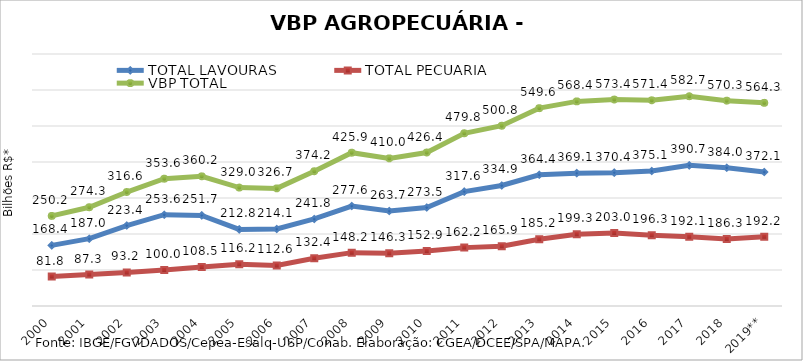
| Category | TOTAL LAVOURAS | TOTAL PECUÁRIA | VBP TOTAL |
|---|---|---|---|
| 2000 | 168.359 | 81.837 | 250.196 |
| 2001 | 187.015 | 87.31 | 274.325 |
| 2002 | 223.396 | 93.204 | 316.6 |
| 2003 | 253.553 | 100.038 | 353.591 |
| 2004 | 251.697 | 108.513 | 360.21 |
| 2005 | 212.798 | 116.244 | 329.042 |
| 2006 | 214.098 | 112.583 | 326.682 |
| 2007 | 241.785 | 132.448 | 374.233 |
| 2008 | 277.629 | 148.241 | 425.87 |
| 2009 | 263.71 | 146.313 | 410.024 |
| 2010 | 273.497 | 152.869 | 426.366 |
| 2011 | 317.633 | 162.155 | 479.788 |
| 2012 | 334.905 | 165.875 | 500.78 |
| 2013 | 364.379 | 185.179 | 549.558 |
| 2014 | 369.067 | 199.305 | 568.372 |
| 2015 | 370.406 | 203.038 | 573.444 |
| 2016 | 375.09 | 196.287 | 571.377 |
| 2017 | 390.675 | 192.069 | 582.743 |
| 2018 | 383.965 | 186.346 | 570.312 |
| 2019** | 372.074 | 192.243 | 564.316 |